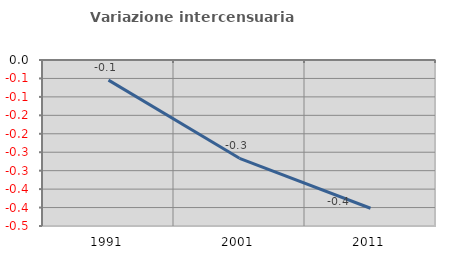
| Category | Variazione intercensuaria annua |
|---|---|
| 1991.0 | -0.055 |
| 2001.0 | -0.266 |
| 2011.0 | -0.402 |